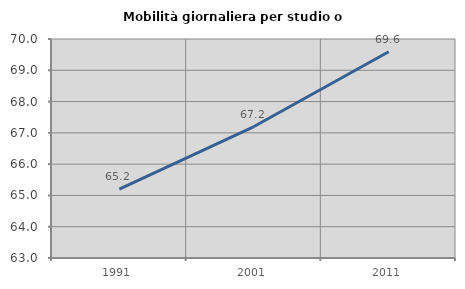
| Category | Mobilità giornaliera per studio o lavoro |
|---|---|
| 1991.0 | 65.199 |
| 2001.0 | 67.202 |
| 2011.0 | 69.592 |